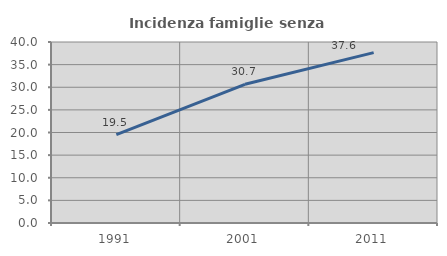
| Category | Incidenza famiglie senza nuclei |
|---|---|
| 1991.0 | 19.545 |
| 2001.0 | 30.654 |
| 2011.0 | 37.644 |